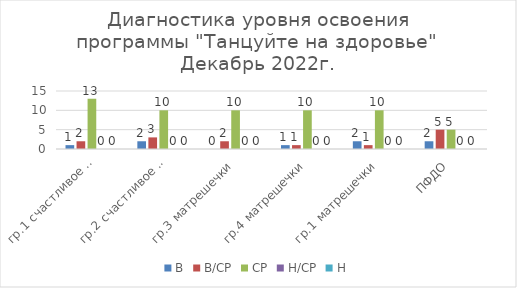
| Category | В | В/СР | СР | Н/СР | Н |
|---|---|---|---|---|---|
| гр.1 счастливое детство | 1 | 2 | 13 | 0 | 0 |
| гр.2 счастливое детство | 2 | 3 | 10 | 0 | 0 |
| гр.3 матрешечки | 0 | 2 | 10 | 0 | 0 |
| гр.4 матрешечки | 1 | 1 | 10 | 0 | 0 |
| гр.1 матрешечки | 2 | 1 | 10 | 0 | 0 |
| ПФДО | 2 | 5 | 5 | 0 | 0 |